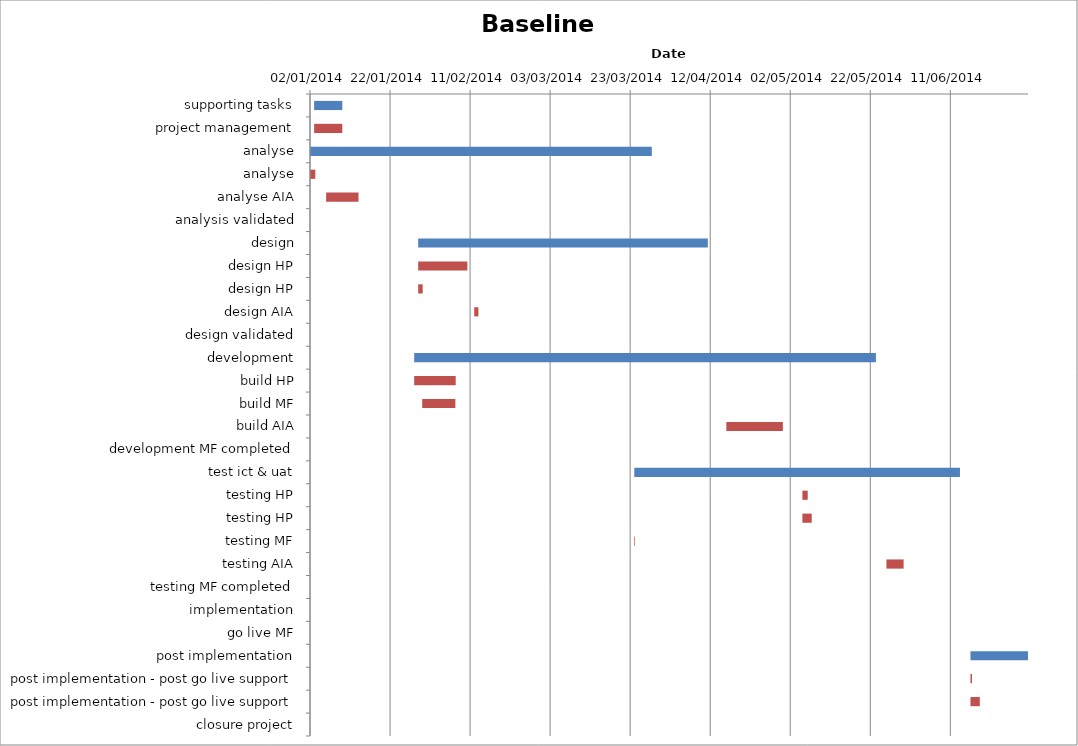
| Category | Baseline start | Actual duration |
|---|---|---|
| supporting tasks | 41642.333 | 7.042 |
| project management | 41642.333 | 7.042 |
| analyse | 41641.333 | 85.375 |
| analyse | 41641.333 | 1.292 |
| analyse AIA | 41645.333 | 8.083 |
| analysis validated | 41726.708 | 0 |
| design | 41668.333 | 72.375 |
| design HP | 41668.333 | 12.292 |
| design HP | 41668.333 | 1.125 |
| design AIA | 41682.333 | 1.042 |
| design validated | 41740.708 | 0 |
| development | 41667.333 | 115.375 |
| build HP | 41667.333 | 10.375 |
| build MF | 41669.333 | 8.292 |
| build AIA | 41745.333 | 14.125 |
| development MF completed | 41782.708 | 0 |
| test ict & uat | 41722.333 | 81.375 |
| testing HP | 41764.333 | 1.333 |
| testing HP | 41764.333 | 2.333 |
| testing MF | 41722.333 | 0.167 |
| testing AIA | 41785.333 | 4.292 |
| testing MF completed | 41803.708 | 0 |
| implementation | 41806.708 | 0 |
| go live MF | 41806.708 | 0 |
| post implementation | 41806.333 | 14.375 |
| post implementation - post go live support | 41806.333 | 0.375 |
| post implementation - post go live support | 41806.333 | 2.333 |
| closure project | 41820.708 | 0 |